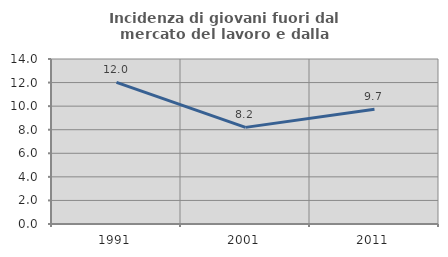
| Category | Incidenza di giovani fuori dal mercato del lavoro e dalla formazione  |
|---|---|
| 1991.0 | 12.014 |
| 2001.0 | 8.199 |
| 2011.0 | 9.742 |